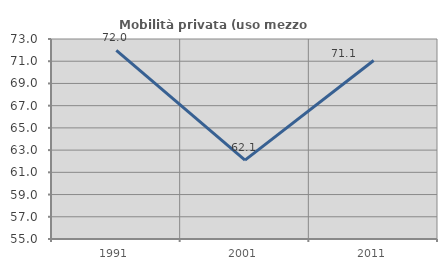
| Category | Mobilità privata (uso mezzo privato) |
|---|---|
| 1991.0 | 71.968 |
| 2001.0 | 62.093 |
| 2011.0 | 71.062 |